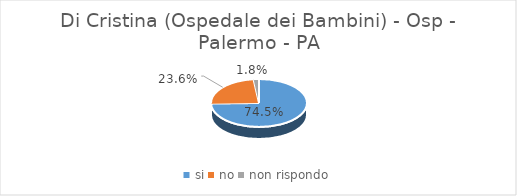
| Category | Di Cristina (Ospedale dei Bambini) - Osp -  Palermo - PA |
|---|---|
| si | 0.745 |
| no | 0.236 |
| non rispondo | 0.018 |